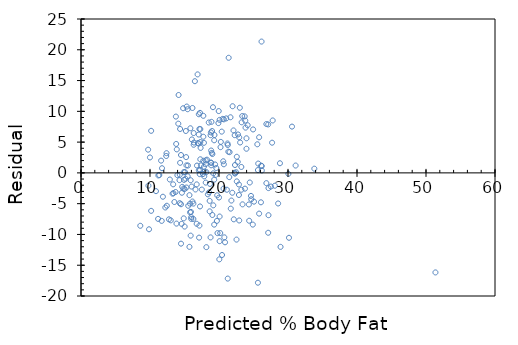
| Category | Series 0 |
|---|---|
| 14.8440495136768 | -2.544 |
| 18.166171905866417 | -12.066 |
| 14.800337376937463 | 10.5 |
| 20.176930195875922 | -9.777 |
| 20.089505922397247 | 8.61 |
| 24.6355681432883 | -3.736 |
| 19.52124814478587 | -0.321 |
| 18.647005409999124 | -6.247 |
| 21.26973361435935 | -17.17 |
| 22.537385579800127 | -10.837 |
| 20.439203016311946 | -13.339 |
| 25.640947288293052 | -17.841 |
| 19.433823871307194 | 1.366 |
| 23.76132540850156 | -2.561 |
| 20.70147583674797 | 1.399 |
| 16.33026216281426 | 4.57 |
| 22.100264212406753 | 6.9 |
| 24.460719596330957 | -1.561 |
| 20.002081648918573 | -4.002 |
| 24.897840963724324 | -8.398 |
| 19.17155105087117 | -0.072 |
| 22.930794810454156 | -7.731 |
| 12.396169856273929 | 3.204 |
| 13.882382505411385 | 3.818 |
| 14.319503872804756 | -0.32 |
| 15.718292248463545 | -12.018 |
| 10.866245070397131 | -2.966 |
| 13.751246095193377 | 9.149 |
| 11.172230027572489 | -7.472 |
| 15.980565068899566 | -7.181 |
| 19.696096691743215 | -7.796 |
| 15.89314079542089 | -10.193 |
| 17.24821703434034 | -5.448 |
| 26.078068655686426 | -4.778 |
| 31.10496438071019 | 1.195 |
| 21.40087002457736 | 18.699 |
| 23.236779767629518 | 0.963 |
| 22.275112759364102 | 6.125 |
| 51.36991097306684 | -16.17 |
| 23.36791617784753 | 9.232 |
| 33.81511685854909 | 0.685 |
| 23.71761327176222 | 9.182 |
| 25.815795835250402 | 5.784 |
| 24.94155310046366 | 7.058 |
| 9.773441651913704 | -2.073 |
| 16.592534983250285 | -2.693 |
| 11.215942164311826 | -0.416 |
| 13.838670368672048 | -8.239 |
| 11.60935139496586 | 1.991 |
| 10.166850882567736 | -6.167 |
| 15.543443701506195 | -5.343 |
| 12.22132130931658 | -5.621 |
| 11.871624215401884 | -3.872 |
| 14.58177669324078 | -8.282 |
| 11.696775668444534 | -7.797 |
| 22.49367344306079 | 0.106 |
| 19.60867241826454 | 0.791 |
| 23.061931220672168 | 4.938 |
| 23.280491904368855 | 8.22 |
| 19.30268746108918 | 5.297 |
| 25.640947288293052 | 0.459 |
| 19.127838914131832 | 10.672 |
| 21.663142845013386 | 9.037 |
| 18.996702503913824 | 6.803 |
| 23.805037545240896 | 8.495 |
| 19.958369512179235 | 10.042 |
| 14.363216009544093 | 7.137 |
| 14.931473787155475 | -1.131 |
| 15.01889806063415 | -8.719 |
| 15.281170881070171 | -2.381 |
| 17.160792760861664 | 7.139 |
| 13.53268541149669 | -4.733 |
| 15.980565068899566 | -7.481 |
| 9.729729515174366 | 3.77 |
| 12.877003360406633 | -1.077 |
| 13.794958231932714 | 4.705 |
| 16.286550026074924 | -7.487 |
| 18.952990367174486 | 3.247 |
| 16.06798934237824 | 5.432 |
| 17.81647481195172 | 0.984 |
| 16.50511070977161 | 14.895 |
| 14.14465532584741 | 12.655 |
| 21.138597204141337 | -2.739 |
| 17.729050538473047 | 9.271 |
| 17.24821703434034 | 9.752 |
| 17.073368487382993 | 9.527 |
| 15.45601942802752 | -0.556 |
| 15.849428658681553 | 7.251 |
| 18.778141820217137 | -10.478 |
| 18.647005409999124 | -4.547 |
| 18.821853956956474 | 1.678 |
| 19.30268746108918 | -1.103 |
| 16.76738353020763 | -8.267 |
| 21.532006434795374 | 3.368 |
| 20.089505922397247 | -11.09 |
| 27.127159937430516 | -9.727 |
| 20.876324383705313 | -11.276 |
| 16.286550026074924 | -4.987 |
| 15.237458744330837 | 2.563 |
| 22.31882489610344 | -0.119 |
| 22.581097716539464 | -1.381 |
| 18.25359617934509 | 2.146 |
| 18.078747632387746 | 2.021 |
| 22.275112759364102 | 0.025 |
| 18.821853956956474 | 6.578 |
| 16.81109566694697 | 1.189 |
| 22.88708267371482 | -3.587 |
| 23.411628314586867 | -5.112 |
| 21.79427925523139 | -4.494 |
| 17.335641307819014 | 4.064 |
| 17.729050538473047 | 1.971 |
| 19.914657375439898 | 8.085 |
| 19.04041464065316 | 3.06 |
| 16.3739742995536 | 4.926 |
| 18.515868999781116 | 8.184 |
| 15.499731564766858 | 1.2 |
| 18.86556609369581 | 1.234 |
| 19.17155105087117 | -5.272 |
| 21.26973361435935 | 4.53 |
| 20.657763700008633 | -2.558 |
| 23.979886092198246 | 3.92 |
| 20.264354469354597 | 5.036 |
| 15.89314079542089 | -1.193 |
| 14.363216009544093 | 1.637 |
| 16.024277205638903 | -2.224 |
| 17.073368487382993 | 0.427 |
| 18.90927823043515 | 8.291 |
| 14.494352419762105 | 2.906 |
| 21.488294298056037 | -0.688 |
| 16.76738353020763 | -1.867 |
| 17.903899085430396 | 0.196 |
| 17.81647481195172 | 4.884 |
| 22.31882489610344 | 1.281 |
| 15.324883017809508 | 10.775 |
| 17.291929171079676 | 7.108 |
| 20.39549087957261 | 6.705 |
| 17.029656350643656 | 4.77 |
| 20.70147583674797 | 8.699 |
| 17.291929171079676 | 5.008 |
| 25.072689510681673 | -4.673 |
| 18.778141820217137 | 6.122 |
| 18.166171905866417 | 0.134 |
| 17.073368487382993 | 6.227 |
| 15.805716521942216 | -6.406 |
| 20.771415255530908 | -10.471 |
| 15.150034470852162 | -0.95 |
| 24.329583186112945 | -5.13 |
| 23.979886092198246 | 5.62 |
| 13.008139770624645 | -7.708 |
| 26.864887116994492 | -1.665 |
| 14.494352419762105 | -5.094 |
| 30.143297372444774 | -10.543 |
| 13.401549001278678 | -3.302 |
| 15.281170881070171 | 1.219 |
| 22.88708267371482 | -1.887 |
| 17.86018694869106 | -0.56 |
| 23.848749681980234 | 7.351 |
| 19.78352096522189 | -9.784 |
| 11.740487805183871 | 0.76 |
| 18.86556609369581 | 3.634 |
| 14.319503872804756 | -4.92 |
| 22.14397634914609 | -7.544 |
| 20.089505922397247 | -7.09 |
| 12.352457719534591 | 2.748 |
| 26.121780792425763 | 1.178 |
| 25.815795835250402 | -6.616 |
| 16.94223207716498 | 4.858 |
| 27.170872074169854 | -6.871 |
| 27.78284198852057 | 8.517 |
| 18.078747632387746 | -1.579 |
| 14.494352419762105 | -11.494 |
| 9.860865925392378 | -9.161 |
| 18.86556609369581 | 1.634 |
| 18.690717546738462 | -1.791 |
| 27.520569168084545 | -2.221 |
| 13.27041259106067 | -3.37 |
| 14.275791736065422 | -1.176 |
| 30.0558730989661 | -0.156 |
| 20.614051563269296 | 1.886 |
| 28.919357543743335 | -12.019 |
| 26.209205065904438 | 0.391 |
| 8.593213959951601 | -8.593 |
| 13.35783686453934 | -1.858 |
| 15.718292248463545 | -3.618 |
| 17.68533840173371 | -0.185 |
| 17.160792760861664 | -8.561 |
| 28.569660449828636 | -4.97 |
| 24.679280280027637 | -4.279 |
| 23.236779767629518 | -2.737 |
| 20.22064233261526 | 4.179 |
| 14.625488829980117 | -3.225 |
| 30.58041873983814 | 7.52 |
| 21.706854981752716 | -5.807 |
| 27.170872074169854 | -2.471 |
| 16.33026216281426 | 6.47 |
| 19.34639959782852 | 6.154 |
| 15.1937466075915 | 6.806 |
| 17.24821703434034 | 0.452 |
| 17.11708062412233 | -10.517 |
| 17.729050538473047 | 5.871 |
| 19.04041464065316 | -6.84 |
| 14.100943189108072 | 7.999 |
| 22.930794810454156 | 5.769 |
| 20.04579378565791 | -14.046 |
| 26.864887116994492 | 7.935 |
| 24.373295322852282 | -7.773 |
| 16.898519940425643 | 16.001 |
| 21.96912780218874 | 10.831 |
| 15.936852932160228 | -6.337 |
| 15.805716521942216 | -5.006 |
| 12.439881993013262 | -5.34 |
| 25.68465942503239 | 1.515 |
| 17.291929171079676 | 2.208 |
| 21.925415665449403 | -3.225 |
| 18.078747632387746 | 1.421 |
| 26.1654929291651 | 21.335 |
| 13.96980677889006 | -0.37 |
| 14.887761650416138 | -7.388 |
| 22.71223412675747 | 1.788 |
| 14.887761650416138 | 0.112 |
| 14.669200966719455 | -2.269 |
| 28.08882694569593 | -2.089 |
| 16.155413615856915 | -4.655 |
| 12.745866950188624 | -7.546 |
| 19.30268746108918 | -8.403 |
| 9.99200233561039 | 2.508 |
| 17.510489854776363 | -2.71 |
| 22.581097716539464 | 2.619 |
| 18.384732589563104 | -3.485 |
| 17.204504897601 | -0.205 |
| 13.70753395845404 | -3.108 |
| 19.739808828482552 | -3.64 |
| 18.559581136520453 | -3.16 |
| 16.155413615856915 | 10.545 |
| 15.45601942802752 | 10.344 |
| 17.37935344455835 | 1.221 |
| 21.357157887838024 | 3.443 |
| 26.1917202112087 | 1.108 |
| 15.01889806063415 | -2.619 |
| 21.051172930662663 | 8.849 |
| 10.166850882567736 | 6.833 |
| 27.127159937430516 | 7.873 |
| 28.83193327026466 | 1.568 |
| 27.695417715041895 | 4.905 |
| 22.755946263496806 | 6.244 |
| 15.062610197373488 | 0.137 |
| 25.553523014814377 | 4.646 |
| 11.347078574529839 | -0.347 |
| 23.01821908393283 | 10.582 |
| 20.52662728979062 | 8.773 |
| 21.226021477620012 | 4.774 |
| 24.154734639155595 | 7.745 |